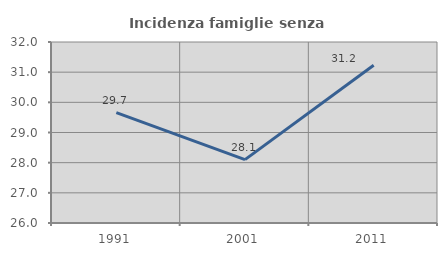
| Category | Incidenza famiglie senza nuclei |
|---|---|
| 1991.0 | 29.661 |
| 2001.0 | 28.101 |
| 2011.0 | 31.23 |